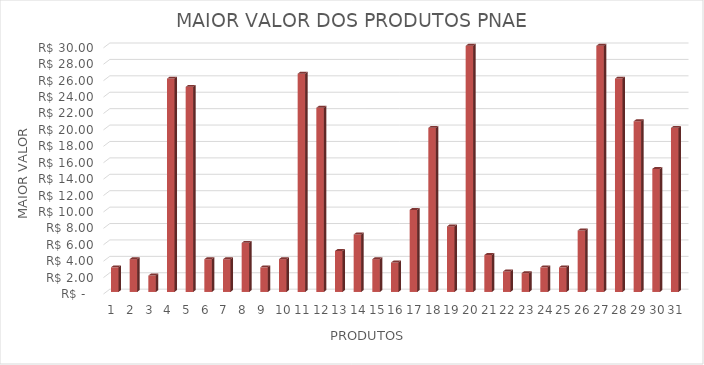
| Category | Series 0 |
|---|---|
| 0 | 3 |
| 1 | 4 |
| 2 | 2 |
| 3 | 26 |
| 4 | 25 |
| 5 | 3.99 |
| 6 | 3.99 |
| 7 | 5.99 |
| 8 | 3 |
| 9 | 4 |
| 10 | 26.6 |
| 11 | 22.45 |
| 12 | 5 |
| 13 | 7 |
| 14 | 4 |
| 15 | 3.59 |
| 16 | 10 |
| 17 | 20 |
| 18 | 7.99 |
| 19 | 53.1 |
| 20 | 4.5 |
| 21 | 2.5 |
| 22 | 2.29 |
| 23 | 3 |
| 24 | 3 |
| 25 | 7.49 |
| 26 | 35 |
| 27 | 26 |
| 28 | 20.8 |
| 29 | 15 |
| 30 | 20 |